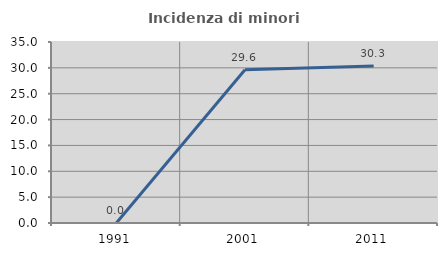
| Category | Incidenza di minori stranieri |
|---|---|
| 1991.0 | 0 |
| 2001.0 | 29.63 |
| 2011.0 | 30.337 |